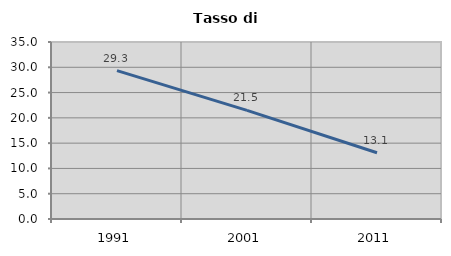
| Category | Tasso di disoccupazione   |
|---|---|
| 1991.0 | 29.343 |
| 2001.0 | 21.479 |
| 2011.0 | 13.095 |